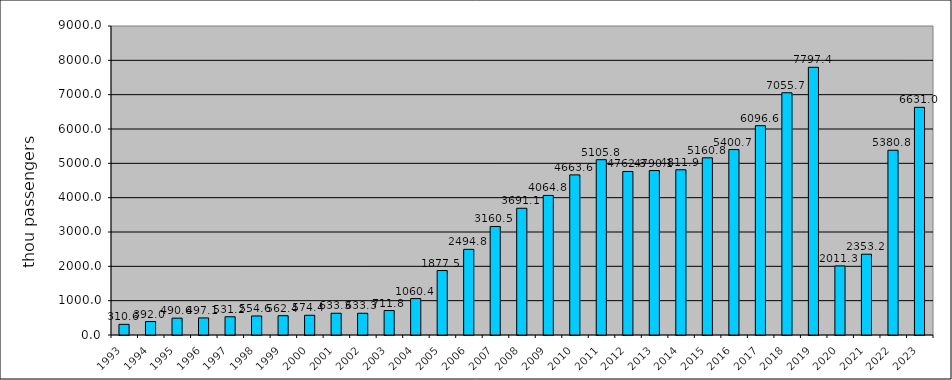
| Category | Series 0 |
|---|---|
| 1993.0 | 310.6 |
| 1994.0 | 392 |
| 1995.0 | 490.62 |
| 1996.0 | 497.13 |
| 1997.0 | 531.22 |
| 1998.0 | 554.62 |
| 1999.0 | 562.383 |
| 2000.0 | 574.356 |
| 2001.0 | 633.319 |
| 2002.0 | 633.319 |
| 2003.0 | 711.848 |
| 2004.0 | 1060.384 |
| 2005.0 | 1877.461 |
| 2006.0 | 2494.835 |
| 2007.0 | 3160.535 |
| 2008.0 | 3691.099 |
| 2009.0 | 4064.755 |
| 2010.0 | 4663.647 |
| 2011.0 | 5105.818 |
| 2012.0 | 4762.335 |
| 2013.0 | 4790.136 |
| 2014.0 | 4811.949 |
| 2015.0 | 5160.759 |
| 2016.0 | 5400.709 |
| 2017.0 | 6096.62 |
| 2018.0 | 7055.734 |
| 2019.0 | 7797.398 |
| 2020.0 | 2011.274 |
| 2021.0 | 2353.246 |
| 2022.0 | 5380.812 |
| 2023.0 | 6630.965 |